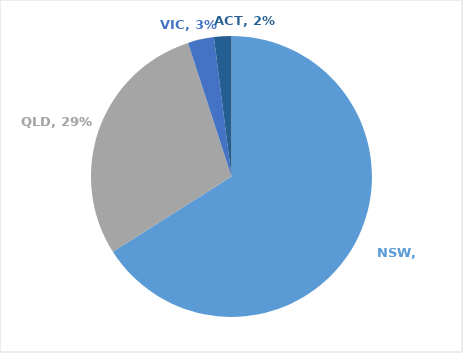
| Category | Series 0 |
|---|---|
| NSW | 0.66 |
| QLD | 0.29 |
| VIC | 0.03 |
| ACT | 0.02 |